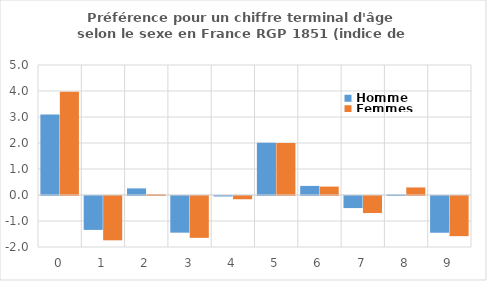
| Category | Homme | Femmes |
|---|---|---|
| 0.0 | 3.1 | 3.976 |
| 1.0 | -1.304 | -1.704 |
| 2.0 | 0.254 | 0.027 |
| 3.0 | -1.41 | -1.609 |
| 4.0 | -0.018 | -0.125 |
| 5.0 | 2.014 | 2.003 |
| 6.0 | 0.35 | 0.324 |
| 7.0 | -0.465 | -0.656 |
| 8.0 | 0.017 | 0.291 |
| 9.0 | -1.413 | -1.545 |